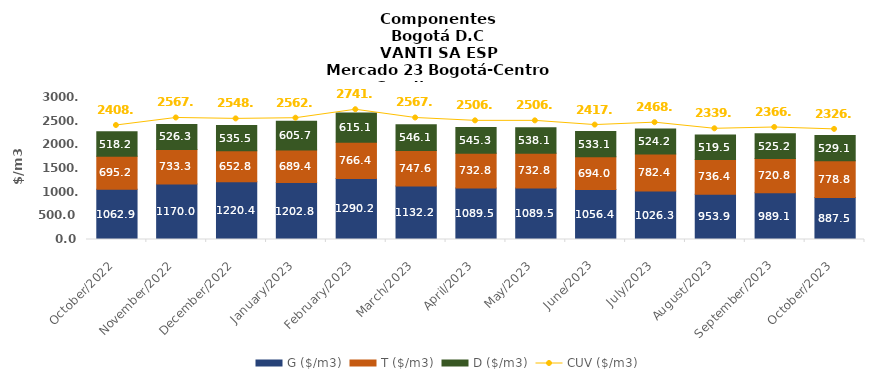
| Category | G ($/m3) | T ($/m3) | D ($/m3) |
|---|---|---|---|
| 2022-10-01 | 1062.85 | 695.15 | 518.18 |
| 2022-11-01 | 1169.95 | 733.29 | 526.27 |
| 2022-12-01 | 1220.44 | 652.77 | 535.5 |
| 2023-01-01 | 1202.77 | 689.37 | 605.73 |
| 2023-02-01 | 1290.19 | 766.35 | 615.06 |
| 2023-03-01 | 1132.24 | 747.55 | 546.05 |
| 2023-04-01 | 1089.52 | 732.84 | 545.26 |
| 2023-05-01 | 1089.52 | 732.84 | 538.11 |
| 2023-06-01 | 1056.38 | 694.03 | 533.13 |
| 2023-07-01 | 1026.28 | 782.44 | 524.19 |
| 2023-08-01 | 953.86 | 736.37 | 519.49 |
| 2023-09-01 | 989.12 | 720.82 | 525.15 |
| 2023-10-01 | 887.54 | 778.8 | 529.13 |